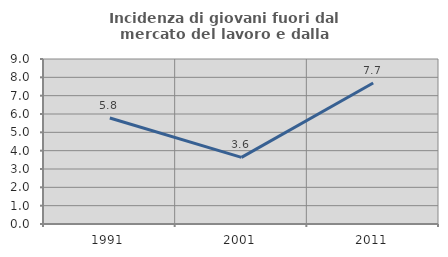
| Category | Incidenza di giovani fuori dal mercato del lavoro e dalla formazione  |
|---|---|
| 1991.0 | 5.785 |
| 2001.0 | 3.636 |
| 2011.0 | 7.692 |